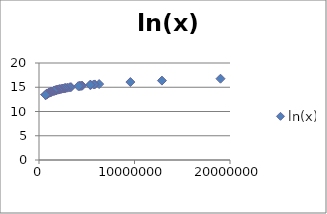
| Category | ln(x) |
|---|---|
| 19006798.0 | 16.76 |
| 12872808.0 | 16.371 |
| 9569624.0 | 16.074 |
| 6300006.0 | 15.656 |
| 5838471.0 | 15.58 |
| 5728143.0 | 15.561 |
| 5414772.0 | 15.505 |
| 5376285.0 | 15.498 |
| 5358130.0 | 15.494 |
| 4522858.0 | 15.325 |
| 4425110.0 | 15.303 |
| 4281899.0 | 15.27 |
| 4274531.0 | 15.268 |
| 4115871.0 | 15.23 |
| 3344813.0 | 15.023 |
| 3229878.0 | 14.988 |
| 3001072.0 | 14.914 |
| 2816710.0 | 14.851 |
| 2733761.0 | 14.821 |
| 2667117.0 | 14.797 |
| 2506626.0 | 14.734 |
| 2351192.0 | 14.67 |
| 2207462.0 | 14.607 |
| 2155137.0 | 14.583 |
| 2109832.0 | 14.562 |
| 2088291.0 | 14.552 |
| 2054574.0 | 14.536 |
| 2031445.0 | 14.524 |
| 2002047.0 | 14.51 |
| 1865746.0 | 14.439 |
| 1819198.0 | 14.414 |
| 1773120.0 | 14.388 |
| 1715459.0 | 14.355 |
| 1701799.0 | 14.347 |
| 1658292.0 | 14.321 |
| 1652602.0 | 14.318 |
| 1600611.0 | 14.286 |
| 1550733.0 | 14.254 |
| 1549308.0 | 14.253 |
| 1313228.0 | 14.088 |
| 1285732.0 | 14.067 |
| 1244696.0 | 14.034 |
| 1225626.0 | 14.019 |
| 1206142.0 | 14.003 |
| 1190512.0 | 13.99 |
| 1134029.0 | 13.941 |
| 1124309.0 | 13.933 |
| 1117608.0 | 13.927 |
| 1115692.0 | 13.925 |
| 1088765.0 | 13.901 |
| 1034090.0 | 13.849 |
| 1012018.0 | 13.827 |
| 916079.0 | 13.728 |
| 909153.0 | 13.72 |
| 905034.0 | 13.716 |
| 895030.0 | 13.705 |
| 853919.0 | 13.658 |
| 846101.0 | 13.648 |
| 845913.0 | 13.648 |
| 837925.0 | 13.639 |
| 836544.0 | 13.637 |
| 808210.0 | 13.603 |
| 800458.0 | 13.593 |
| 797740.0 | 13.59 |
| 781352.0 | 13.569 |
| 776742.0 | 13.563 |
| 770037.0 | 13.554 |
| 734669.0 | 13.507 |
| 716030.0 | 13.481 |
| 710514.0 | 13.474 |
| 699356.0 | 13.458 |
| 698497.0 | 13.457 |
| 687181.0 | 13.44 |
| 682657.0 | 13.434 |
| 681525.0 | 13.432 |